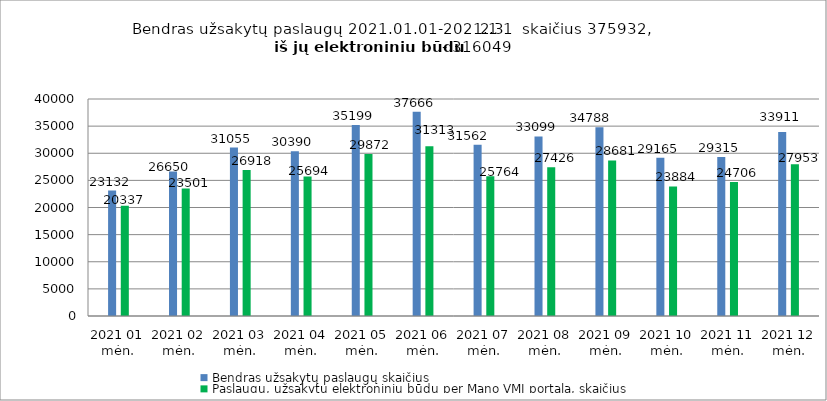
| Category | Bendras užsakytų paslaugų skaičius | Paslaugų, užsakytų elektroniniu būdu per Mano VMI portalą, skaičius |
|---|---|---|
| 2021 01 mėn. | 23132 | 20337 |
| 2021 02 mėn. | 26650 | 23501 |
| 2021 03 mėn. | 31055 | 26918 |
| 2021 04 mėn. | 30390 | 25694 |
| 2021 05 mėn. | 35199 | 29872 |
| 2021 06 mėn. | 37666 | 31313 |
| 2021 07 mėn. | 31562 | 25764 |
| 2021 08 mėn. | 33099 | 27426 |
| 2021 09 mėn. | 34788 | 28681 |
| 2021 10 mėn. | 29165 | 23884 |
| 2021 11 mėn. | 29315 | 24706 |
| 2021 12 mėn. | 33911 | 27953 |